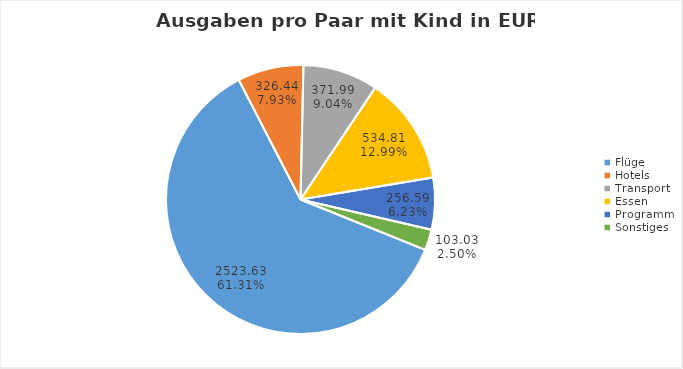
| Category | Series 0 |
|---|---|
| Flüge | 2523.63 |
| Hotels | 326.445 |
| Transport | 371.992 |
| Essen | 534.808 |
| Programm | 256.586 |
| Sonstiges | 103.031 |